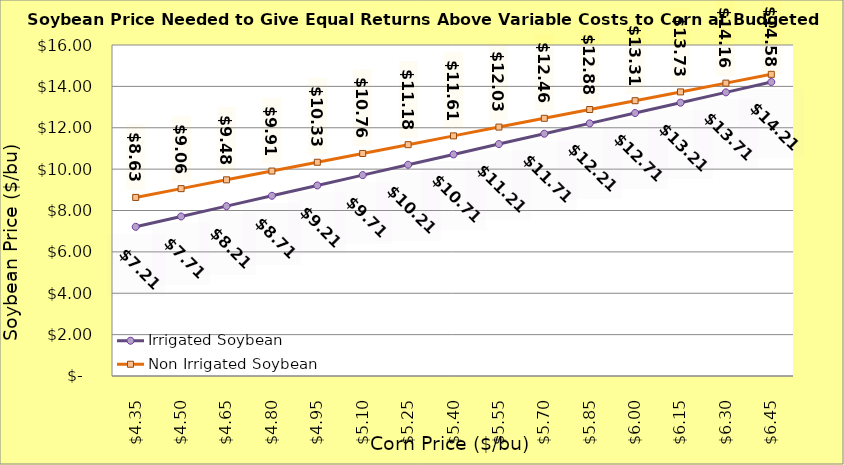
| Category | Irrigated Soybean | Non Irrigated Soybean |
|---|---|---|
| 4.349999999999998 | 7.211 | 8.632 |
| 4.499999999999998 | 7.711 | 9.057 |
| 4.649999999999999 | 8.211 | 9.482 |
| 4.799999999999999 | 8.711 | 9.907 |
| 4.949999999999999 | 9.211 | 10.332 |
| 5.1 | 9.711 | 10.757 |
| 5.25 | 10.211 | 11.182 |
| 5.4 | 10.711 | 11.607 |
| 5.550000000000001 | 11.211 | 12.032 |
| 5.700000000000001 | 11.711 | 12.457 |
| 5.850000000000001 | 12.211 | 12.882 |
| 6.000000000000002 | 12.711 | 13.307 |
| 6.150000000000002 | 13.211 | 13.732 |
| 6.3000000000000025 | 13.711 | 14.157 |
| 6.450000000000003 | 14.211 | 14.582 |